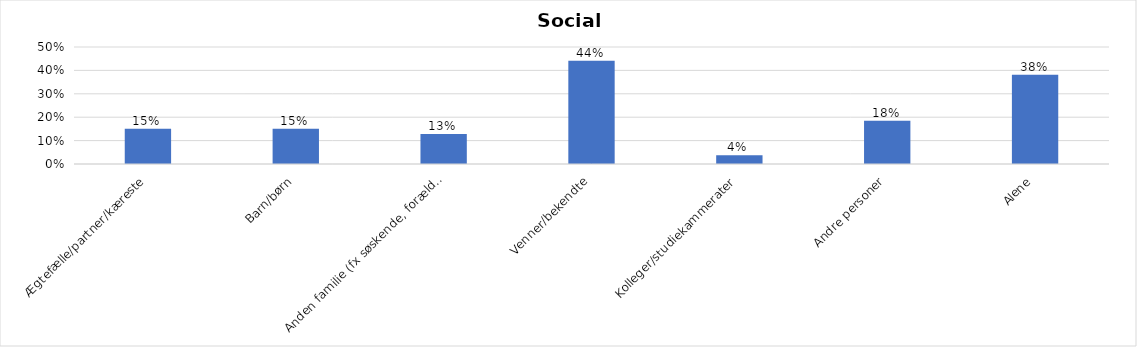
| Category | % |
|---|---|
| Ægtefælle/partner/kæreste | 0.151 |
| Barn/børn | 0.151 |
| Anden familie (fx søskende, forældre) | 0.128 |
| Venner/bekendte | 0.442 |
| Kolleger/studiekammerater | 0.038 |
| Andre personer | 0.185 |
| Alene | 0.381 |